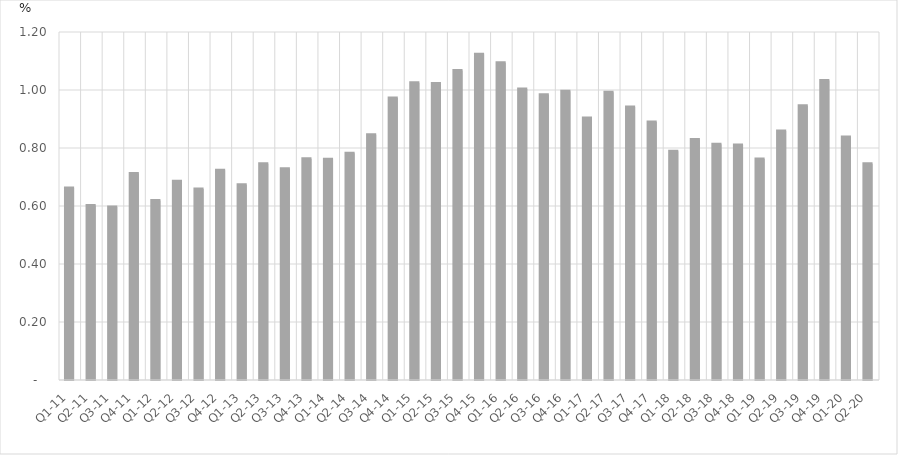
| Category | Percent of Total GDP |
|---|---|
| Q1-11 | 0.662 |
| Q2-11 | 0.601 |
| Q3-11 | 0.596 |
| Q4-11 | 0.712 |
| Q1-12 | 0.619 |
| Q2-12 | 0.685 |
| Q3-12 | 0.659 |
| Q4-12 | 0.724 |
| Q1-13 | 0.673 |
| Q2-13 | 0.746 |
| Q3-13 | 0.728 |
| Q4-13 | 0.763 |
| Q1-14 | 0.762 |
| Q2-14 | 0.782 |
| Q3-14 | 0.846 |
| Q4-14 | 0.972 |
| Q1-15 | 1.025 |
| Q2-15 | 1.022 |
| Q3-15 | 1.067 |
| Q4-15 | 1.123 |
| Q1-16 | 1.094 |
| Q2-16 | 1.003 |
| Q3-16 | 0.984 |
| Q4-16 | 0.995 |
| Q1-17 | 0.903 |
| Q2-17 | 0.992 |
| Q3-17 | 0.941 |
| Q4-17 | 0.889 |
| Q1-18 | 0.789 |
| Q2-18 | 0.829 |
| Q3-18 | 0.813 |
| Q4-18 | 0.81 |
| Q1-19 | 0.762 |
| Q2-19 | 0.858 |
| Q3-19 | 0.946 |
| Q4-19 | 1.033 |
| Q1-20 | 0.838 |
| Q2-20 | 0.746 |